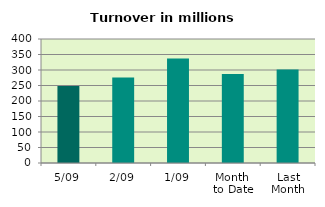
| Category | Series 0 |
|---|---|
| 5/09 | 248.147 |
| 2/09 | 275.643 |
| 1/09 | 337.488 |
| Month 
to Date | 287.093 |
| Last
Month | 301.741 |